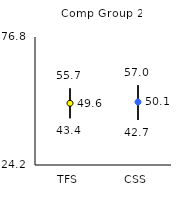
| Category | 25th | 75th | Mean |
|---|---|---|---|
| TFS | 43.4 | 55.7 | 49.56 |
| CSS | 42.7 | 57 | 50.09 |